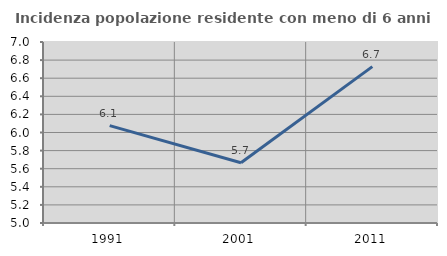
| Category | Incidenza popolazione residente con meno di 6 anni |
|---|---|
| 1991.0 | 6.076 |
| 2001.0 | 5.666 |
| 2011.0 | 6.728 |